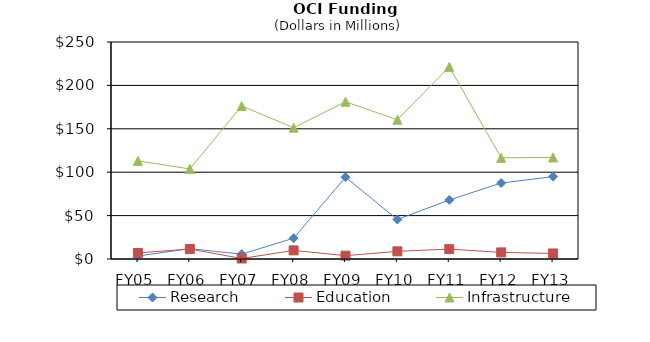
| Category | Research | Education | Infrastructure |
|---|---|---|---|
| FY05 | 3.41 | 6.98 | 113.01 |
| FY06 | 11.9 | 11.48 | 103.76 |
| FY07 | 5.57 | 0.57 | 176.28 |
| FY08 | 23.97 | 9.93 | 151.25 |
| FY09 | 94.21 | 3.85 | 181.17 |
| FY10 | 45.51 | 8.81 | 160.4 |
| FY11 | 68.01 | 11.39 | 221.35 |
| FY12 | 87.48 | 7.6 | 116.56 |
| FY13 | 94.87 | 6.4 | 117 |